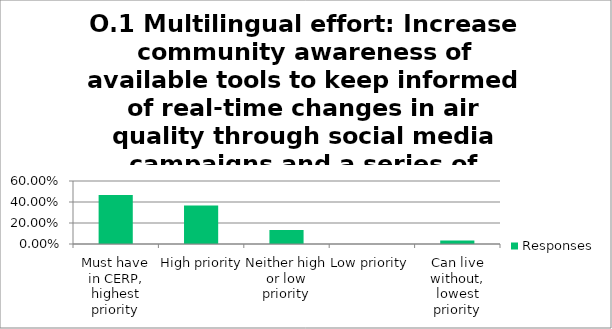
| Category | Responses |
|---|---|
| Must have in CERP, highest priority | 0.467 |
| High priority | 0.367 |
| Neither high or low priority | 0.133 |
| Low priority | 0 |
| Can live without, lowest priority | 0.033 |